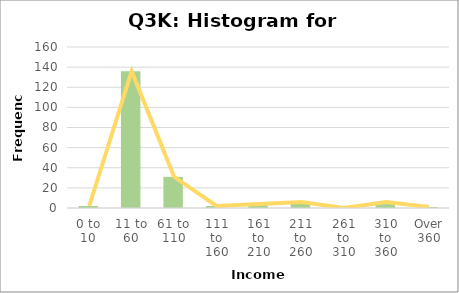
| Category | Series 0 |
|---|---|
| 0 to 10 | 2 |
| 11 to 60 | 136 |
| 61 to 110 | 31 |
| 111 to 160 | 2 |
| 161 to 210 | 4 |
| 211 to 260 | 6 |
| 261 to 310 | 0 |
| 310 to 360 | 6 |
| Over 360 | 1 |